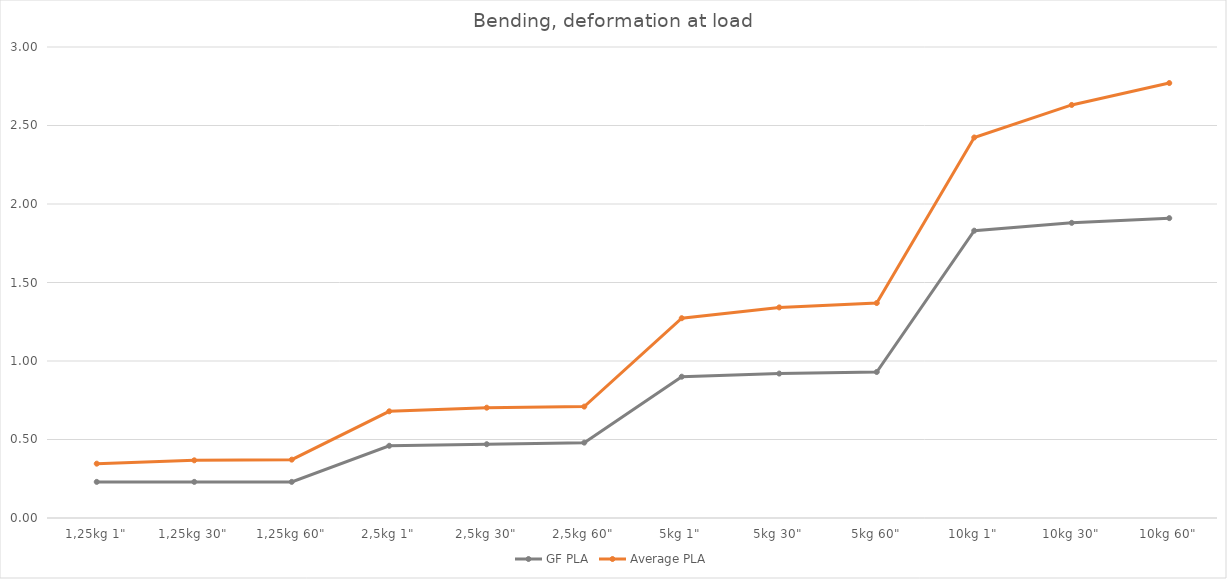
| Category | GF PLA | Average PLA |
|---|---|---|
| 1,25kg 1" | 0.23 | 0.346 |
| 1,25kg 30" | 0.23 | 0.367 |
| 1,25kg 60" | 0.23 | 0.372 |
| 2,5kg 1" | 0.46 | 0.68 |
| 2,5kg 30" | 0.47 | 0.703 |
| 2,5kg 60" | 0.48 | 0.71 |
| 5kg 1" | 0.9 | 1.273 |
| 5kg 30" | 0.92 | 1.341 |
| 5kg 60" | 0.93 | 1.369 |
| 10kg 1" | 1.83 | 2.424 |
| 10kg 30" | 1.88 | 2.631 |
| 10kg 60" | 1.91 | 2.77 |